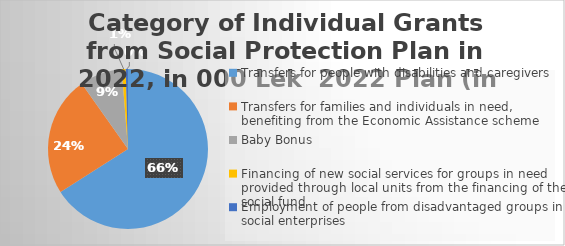
| Category | Category of Individual Grants from Social Protection planned in 2022, in 000 Lek |
|---|---|
| Transfers for people with disabilities and caregivers | 16990000 |
| Transfers for families and individuals in need, benefiting from the Economic Assistance scheme | 6240000 |
| Baby Bonus | 2200000 |
| Financing of new social services for groups in need provided through local units from the financing of the social fund | 200000 |
| Employment of people from disadvantaged groups in social enterprises | 120000 |